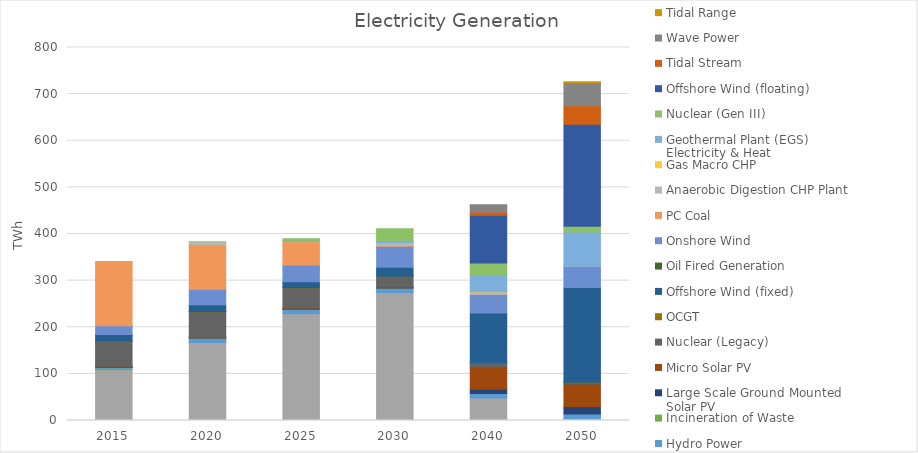
| Category | Biomass Fired Generation | CCGT | Converted Biomass Plant | Hydro Power | Incineration of Waste | Large Scale Ground Mounted Solar PV | Micro Solar PV | Nuclear (Legacy) | OCGT | Offshore Wind (fixed) | Oil Fired Generation | Onshore Wind | PC Coal | Anaerobic Digestion CHP Plant | Gas Macro CHP | Geothermal Plant (EGS) Electricity & Heat | Nuclear (Gen III) | Offshore Wind (floating) | Tidal Stream | Wave Power | Tidal Range |
|---|---|---|---|---|---|---|---|---|---|---|---|---|---|---|---|---|---|---|---|---|---|
| 2015.0 | 0.035 | 108.011 | 0.29 | 4.91 | 0.262 | 0.787 | 2.089 | 53.453 | 0.513 | 14.219 | 0.01 | 18.776 | 137.53 | 0 | 0 | 0 | 0 | 0 | 0 | 0 | 0 |
| 2020.0 | 0.028 | 166.491 | 0.29 | 9.738 | 0.21 | 0.787 | 2.089 | 53.453 | 0.665 | 14.249 | 0 | 33.276 | 95.886 | 5.375 | 0.075 | 0.133 | 0 | 0 | 0 | 0 | 0 |
| 2025.0 | 0.021 | 228.848 | 0 | 9.479 | 0.157 | 0.787 | 2.089 | 42.691 | 0.384 | 13.108 | 0 | 36.112 | 49.511 | 0.485 | 0.318 | 0.133 | 5.504 | 0 | 0 | 0 | 0 |
| 2030.0 | 0.056 | 274.248 | 0 | 9.738 | 0.105 | 0.787 | 2.089 | 22.021 | 0.361 | 19.253 | 0 | 45.037 | 1.241 | 5.455 | 0.313 | 5.509 | 25.16 | 0 | 0 | 0 | 0 |
| 2040.0 | 0 | 48.339 | 0 | 9.738 | 0 | 9.036 | 48.608 | 7.283 | 0.125 | 107.205 | 0 | 39.926 | 0 | 5.55 | 0.065 | 36.602 | 25.16 | 102.402 | 7.196 | 15.698 | 0 |
| 2050.0 | 0 | 4.235 | 0 | 9.738 | 0 | 15.93 | 48.608 | 3.638 | 0.132 | 203.114 | 0 | 45.53 | 0 | 0.002 | 0 | 73.121 | 12.58 | 218.7 | 39.956 | 49.222 | 1.796 |